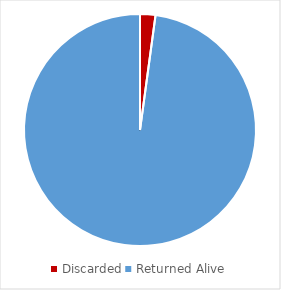
| Category | Series 0 |
|---|---|
| Discarded | 43 |
| Returned Alive | 1966 |